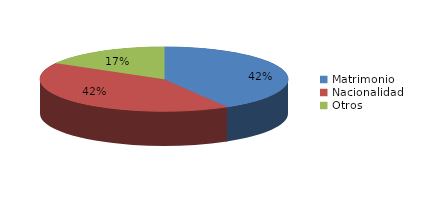
| Category | Series 0 |
|---|---|
| Matrimonio | 407 |
| Nacionalidad | 409 |
| Otros | 164 |